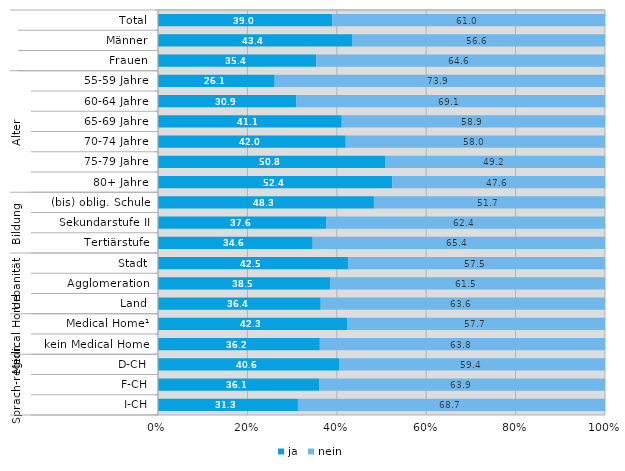
| Category | ja | nein |
|---|---|---|
| 0 | 39 | 61 |
| 1 | 43.4 | 56.6 |
| 2 | 35.4 | 64.6 |
| 3 | 26.1 | 73.9 |
| 4 | 30.9 | 69.1 |
| 5 | 41.1 | 58.9 |
| 6 | 42 | 58 |
| 7 | 50.8 | 49.2 |
| 8 | 52.4 | 47.6 |
| 9 | 48.3 | 51.7 |
| 10 | 37.6 | 62.4 |
| 11 | 34.6 | 65.4 |
| 12 | 42.5 | 57.5 |
| 13 | 38.5 | 61.5 |
| 14 | 36.4 | 63.6 |
| 15 | 42.3 | 57.7 |
| 16 | 36.2 | 63.8 |
| 17 | 40.6 | 59.4 |
| 18 | 36.1 | 63.9 |
| 19 | 31.3 | 68.7 |